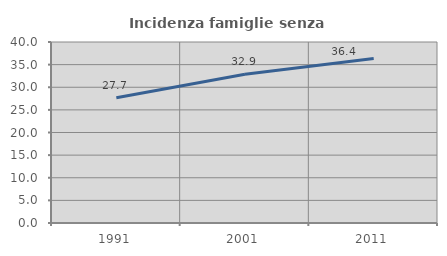
| Category | Incidenza famiglie senza nuclei |
|---|---|
| 1991.0 | 27.673 |
| 2001.0 | 32.852 |
| 2011.0 | 36.366 |